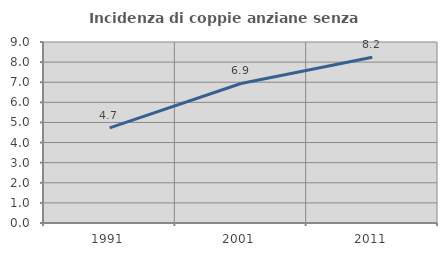
| Category | Incidenza di coppie anziane senza figli  |
|---|---|
| 1991.0 | 4.73 |
| 2001.0 | 6.937 |
| 2011.0 | 8.244 |